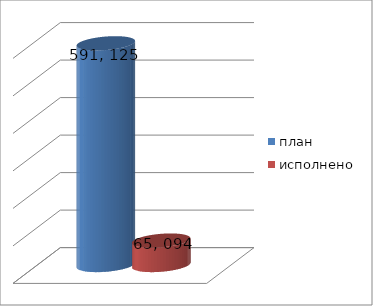
| Category | план | исполнено |
|---|---|---|
| 0 | 591125831.66 | 65094050.27 |